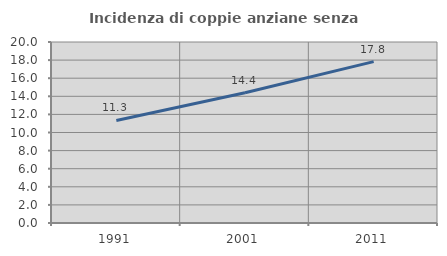
| Category | Incidenza di coppie anziane senza figli  |
|---|---|
| 1991.0 | 11.336 |
| 2001.0 | 14.385 |
| 2011.0 | 17.835 |